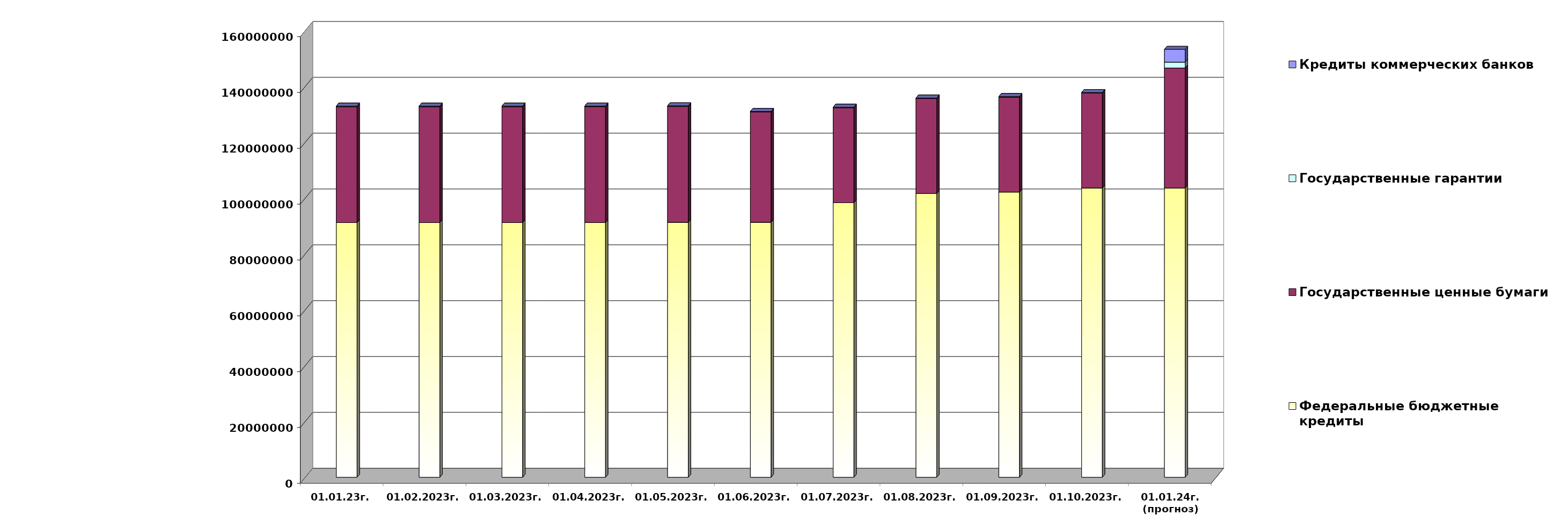
| Category | Федеральные бюджетные кредиты | Государственные ценные бумаги  | Государственные гарантии | Кредиты коммерческих банков |
|---|---|---|---|---|
| 01.01.23г. | 91228290.06 | 41500000 | 219957.743 | 0 |
| 01.02.2023г. | 91228290.06 | 41500000 | 217186.67 | 0 |
| 01.03.2023г. | 91228290.06 | 41500000 | 217186.67 | 0 |
| 01.04.2023г. | 91246617.843 | 41500000 | 218702.544 | 0 |
| 01.05.2023г. | 91334953.062 | 41500000 | 216632.858 | 0 |
| 01.06.2023г. | 91334953.062 | 39500000 | 201889.62 | 0 |
| 01.07.2023г. | 98352839.325 | 34000000 | 202402.323 | 0 |
| 01.08.2023г. | 101647637.335 | 34000000 | 198707.557 | 0 |
| 01.09.2023г. | 102154910.819 | 34000000 | 198971.052 | 0 |
| 01.10.2023г. | 103607689.942 | 34000000 | 199238.75 | 0 |
| 01.01.24г.
(прогноз) | 103594267.9 | 43000000 | 2096427.8 | 4601422.3 |